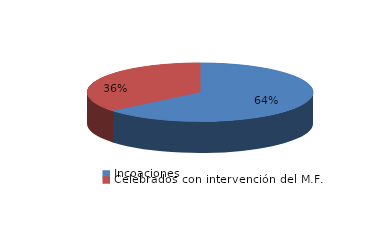
| Category | Series 0 |
|---|---|
| Incoaciones | 787 |
| Celebrados con intervención del M.F. | 443 |